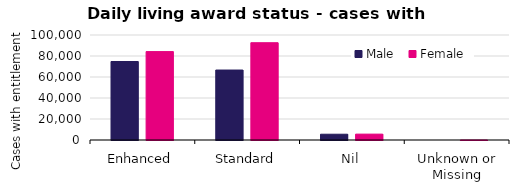
| Category | Male  | Female |
|---|---|---|
| Enhanced | 74751 | 84183 |
| Standard | 66623 | 92662 |
| Nil | 5505 | 5595 |
| Unknown or Missing | 0 | 10 |